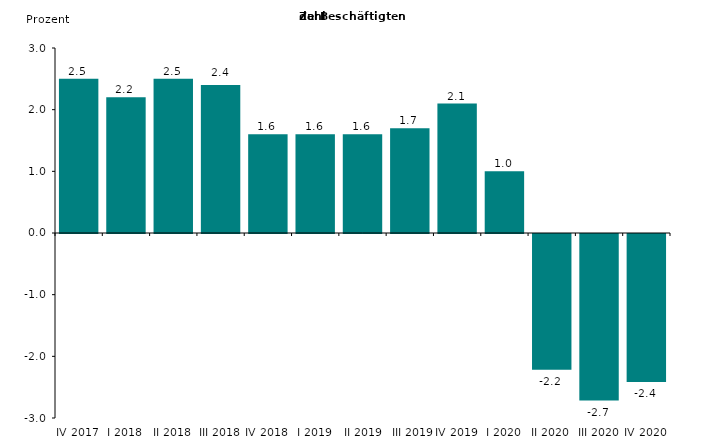
| Category | Series 0 |
|---|---|
| IV 2017 | 2.5 |
| I 2018 | 2.2 |
| II 2018 | 2.5 |
| III 2018 | 2.4 |
| IV 2018 | 1.6 |
| I 2019 | 1.6 |
|  II 2019 | 1.6 |
|  III 2019 | 1.7 |
| IV 2019 | 2.1 |
| I 2020 | 1 |
| II 2020 | -2.2 |
| III 2020 | -2.7 |
| IV 2020 | -2.4 |